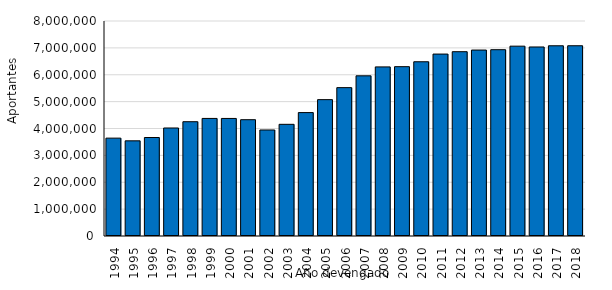
| Category | Demora en el pago hasta 12 meses |
|---|---|
| 1994.0 | 3641691 |
| 1995.0 | 3540706 |
| 1996.0 | 3664619 |
| 1997.0 | 4018920 |
| 1998.0 | 4252875 |
| 1999.0 | 4374629 |
| 2000.0 | 4374086 |
| 2001.0 | 4327585 |
| 2002.0 | 3944881 |
| 2003.0 | 4155251 |
| 2004.0 | 4591915 |
| 2005.0 | 5073845 |
| 2006.0 | 5520871 |
| 2007.0 | 5960254 |
| 2008.0 | 6292136 |
| 2009.0 | 6300715 |
| 2010.0 | 6483467 |
| 2011.0 | 6769225 |
| 2012.0 | 6857720 |
| 2013.0 | 6918936 |
| 2014.0 | 6932356 |
| 2015.0 | 7063868 |
| 2016.0 | 7033569 |
| 2017.0 | 7078267 |
| 2018.0 | 7079366 |